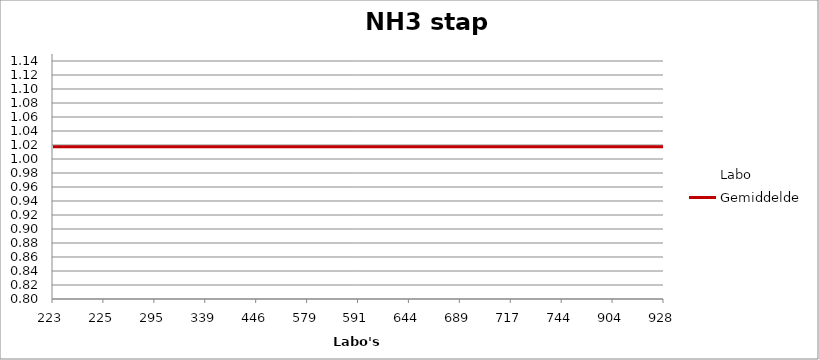
| Category | Labo | Gemiddelde |
|---|---|---|
| 223.0 | 1.001 | 1.017 |
| 225.0 | 1.117 | 1.017 |
| 295.0 | 0.976 | 1.017 |
| 339.0 | 1.017 | 1.017 |
| 446.0 | 1.044 | 1.017 |
| 579.0 | 1.088 | 1.017 |
| 591.0 | 1.044 | 1.017 |
| 644.0 | 0.811 | 1.017 |
| 689.0 | 0.979 | 1.017 |
| 717.0 | 1.037 | 1.017 |
| 744.0 | 0.966 | 1.017 |
| 904.0 | 0.949 | 1.017 |
| 928.0 | 1.039 | 1.017 |